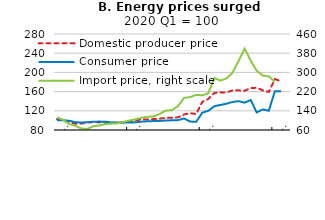
| Category | Domestic producer price | Consumer price |
|---|---|---|
| 2020-01-15 | 102.583 | 100.617 |
| 2020-02-15 | 100.646 | 100.154 |
| 2020-03-15 | 96.771 | 99.229 |
| 2020-04-15 | 93.081 | 96.363 |
| 2020-05-15 | 93.542 | 95.623 |
| 2020-06-15 | 95.295 | 96.27 |
| 2020-07-15 | 96.494 | 97.38 |
| 2020-08-15 | 96.125 | 97.472 |
| 2020-09-15 | 95.387 | 97.287 |
| 2020-10-15 | 95.018 | 95.715 |
| 2020-11-15 | 94.834 | 95.623 |
| 2020-12-15 | 95.664 | 95.808 |
| 2021-01-15 | 98.339 | 95.623 |
| 2021-02-15 | 100.185 | 95.993 |
| 2021-03-15 | 102.214 | 97.38 |
| 2021-04-15 | 102.03 | 98.212 |
| 2021-05-15 | 102.768 | 98.582 |
| 2021-06-15 | 103.782 | 98.952 |
| 2021-07-15 | 105.258 | 99.784 |
| 2021-08-15 | 105.443 | 100.154 |
| 2021-09-15 | 106.458 | 100.617 |
| 2021-10-15 | 112.454 | 103.946 |
| 2021-11-15 | 114.945 | 97.565 |
| 2021-12-15 | 113.376 | 97.01 |
| 2022-01-15 | 138.561 | 115.968 |
| 2022-02-15 | 144.649 | 120.037 |
| 2022-03-15 | 157.103 | 129.562 |
| 2022-04-15 | 158.303 | 132.152 |
| 2022-05-15 | 158.21 | 134.834 |
| 2022-06-15 | 162.454 | 138.348 |
| 2022-07-15 | 162.638 | 140.012 |
| 2022-08-15 | 161.624 | 137.053 |
| 2022-09-15 | 167.435 | 142.324 |
| 2022-10-15 | 167.897 | 116.708 |
| 2022-11-15 | 162.638 | 122.811 |
| 2022-12-15 | 159.225 | 120.129 |
| 2023-01-15 | 185.949 | 160.728 |
| 2023-02-15 | 181.824 | 160.635 |